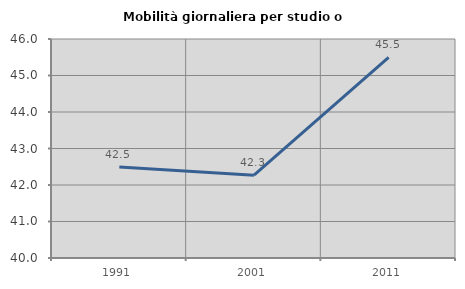
| Category | Mobilità giornaliera per studio o lavoro |
|---|---|
| 1991.0 | 42.493 |
| 2001.0 | 42.27 |
| 2011.0 | 45.498 |